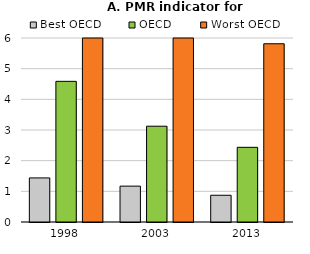
| Category | Best OECD | OECD | Worst OECD |
|---|---|---|---|
| 1998.0 | 1.438 | 4.587 | 6 |
| 2003.0 | 1.169 | 3.124 | 6 |
| 2013.0 | 0.872 | 2.435 | 5.812 |